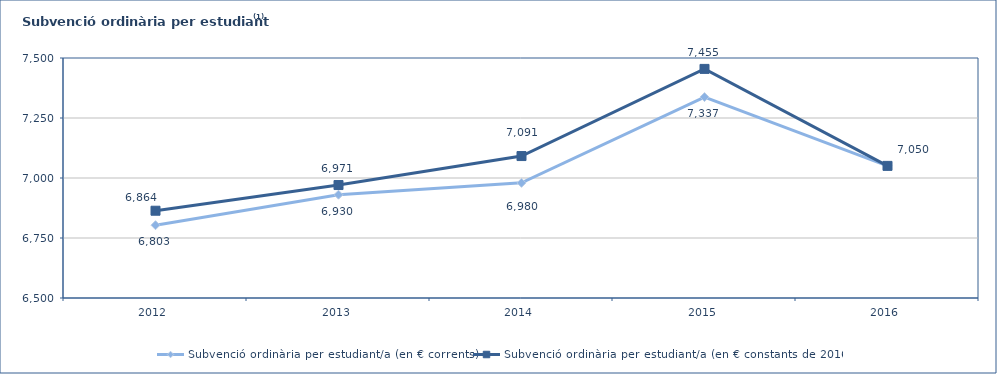
| Category | Subvenció ordinària per estudiant/a (en € corrents) | Subvenció ordinària per estudiant/a (en € constants de 2016) |
|---|---|---|
| 2012.0 | 6803.37 | 6863.631 |
| 2013.0 | 6930.224 | 6970.697 |
| 2014.0 | 6979.758 | 7091.434 |
| 2015.0 | 7337.192 | 7454.587 |
| 2016.0 | 7050.463 | 7050.463 |